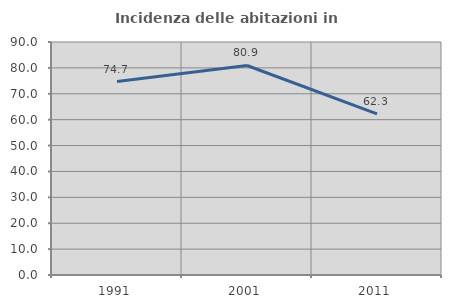
| Category | Incidenza delle abitazioni in proprietà  |
|---|---|
| 1991.0 | 74.718 |
| 2001.0 | 80.928 |
| 2011.0 | 62.258 |